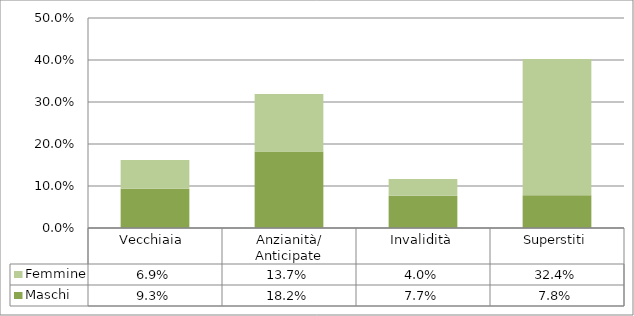
| Category | Maschi | Femmine |
|---|---|---|
| Vecchiaia  | 0.093 | 0.069 |
| Anzianità/ Anticipate | 0.182 | 0.137 |
| Invalidità | 0.077 | 0.04 |
| Superstiti | 0.078 | 0.324 |